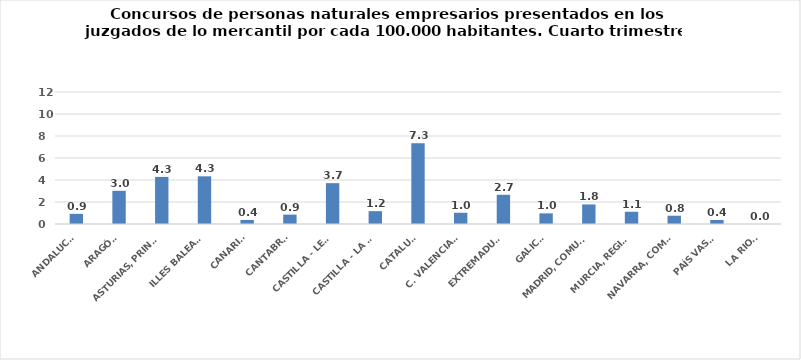
| Category | Series 0 |
|---|---|
| ANDALUCÍA | 0.924 |
| ARAGÓN | 3.018 |
| ASTURIAS, PRINCIPADO | 4.281 |
| ILLES BALEARS | 4.336 |
| CANARIAS | 0.368 |
| CANTABRIA | 0.854 |
| CASTILLA - LEÓN | 3.713 |
| CASTILLA - LA MANCHA | 1.169 |
| CATALUÑA | 7.336 |
| C. VALENCIANA | 1.021 |
| EXTREMADURA | 2.656 |
| GALICIA | 0.967 |
| MADRID, COMUNIDAD | 1.779 |
| MURCIA, REGIÓN | 1.11 |
| NAVARRA, COM. FORAL | 0.753 |
| PAÍS VASCO | 0.362 |
| LA RIOJA | 0 |